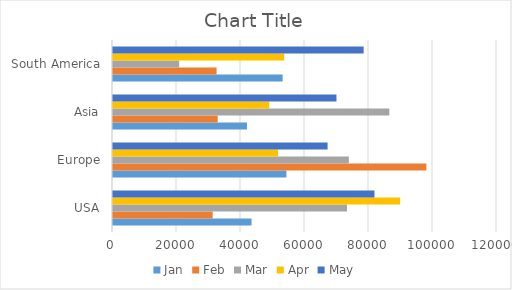
| Category | Jan | Feb | Mar | Apr | May |
|---|---|---|---|---|---|
| USA | 43299 | 31142 | 73130 | 89734 | 81709 |
| Europe | 54193 | 97933 | 73698 | 51598 | 67057 |
| Asia | 41864 | 32721 | 86341 | 48832 | 69829 |
| South America | 53022 | 32366 | 20689 | 53519 | 78326 |